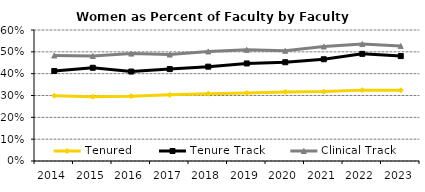
| Category | Tenured | Tenure Track | Clinical Track |
|---|---|---|---|
| 2014.0 | 0.299 | 0.412 | 0.483 |
| 2015.0 | 0.295 | 0.427 | 0.481 |
| 2016.0 | 0.297 | 0.41 | 0.492 |
| 2017.0 | 0.303 | 0.421 | 0.488 |
| 2018.0 | 0.308 | 0.432 | 0.502 |
| 2019.0 | 0.311 | 0.447 | 0.509 |
| 2020.0 | 0.316 | 0.452 | 0.505 |
| 2021.0 | 0.318 | 0.466 | 0.524 |
| 2022.0 | 0.325 | 0.491 | 0.536 |
| 2023.0 | 0.324 | 0.48 | 0.527 |